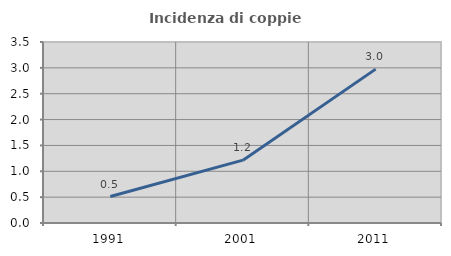
| Category | Incidenza di coppie miste |
|---|---|
| 1991.0 | 0.512 |
| 2001.0 | 1.215 |
| 2011.0 | 2.976 |